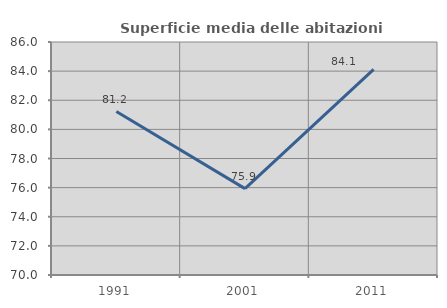
| Category | Superficie media delle abitazioni occupate |
|---|---|
| 1991.0 | 81.226 |
| 2001.0 | 75.932 |
| 2011.0 | 84.118 |